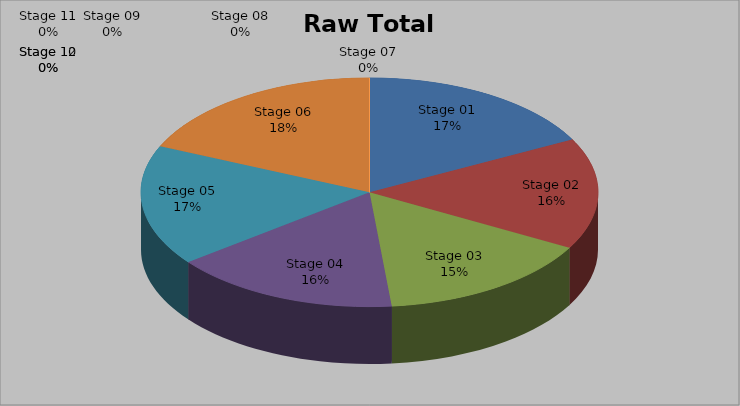
| Category | Raw Total Seconds |
|---|---|
| Stage 01 | 639.64 |
| Stage 02 | 579.62 |
| Stage 03 | 567.48 |
| Stage 04 | 593.65 |
| Stage 05 | 628.11 |
| Stage 06 | 679.28 |
| Stage 07 | 0 |
| Stage 08 | 0 |
| Stage 09 | 0 |
| Stage 10 | 0 |
| Stage 11 | 0 |
| Stage 12 | 0 |